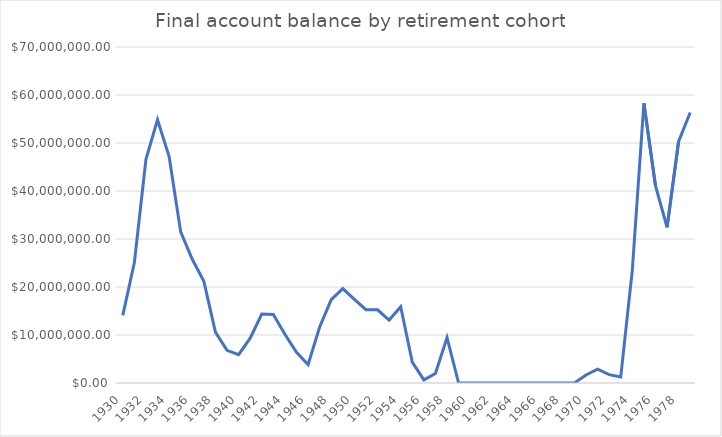
| Category | Series 0 |
|---|---|
| 1930.0 | 14094813.856 |
| 1931.0 | 25095875.067 |
| 1932.0 | 46595267.375 |
| 1933.0 | 54841129.381 |
| 1934.0 | 47190852.395 |
| 1935.0 | 31487907.336 |
| 1936.0 | 25768316.684 |
| 1937.0 | 21182113.767 |
| 1938.0 | 10603782.453 |
| 1939.0 | 6805865.754 |
| 1940.0 | 5912888.325 |
| 1941.0 | 9337849.122 |
| 1942.0 | 14354557.753 |
| 1943.0 | 14292214.108 |
| 1944.0 | 10154979.279 |
| 1945.0 | 6375546.53 |
| 1946.0 | 3840110.596 |
| 1947.0 | 11678718.551 |
| 1948.0 | 17377714.794 |
| 1949.0 | 19674202.73 |
| 1950.0 | 17437694.834 |
| 1951.0 | 15277365.311 |
| 1952.0 | 15255503.96 |
| 1953.0 | 13103291.281 |
| 1954.0 | 15882065.875 |
| 1955.0 | 4336213.872 |
| 1956.0 | 648432.849 |
| 1957.0 | 1986513.274 |
| 1958.0 | 9469623.111 |
| 1959.0 | 0 |
| 1960.0 | 0 |
| 1961.0 | 0 |
| 1962.0 | 0 |
| 1963.0 | 0 |
| 1964.0 | 0 |
| 1965.0 | 0 |
| 1966.0 | 0 |
| 1967.0 | 0 |
| 1968.0 | 0 |
| 1969.0 | 0 |
| 1970.0 | 1662616.496 |
| 1971.0 | 2895100.056 |
| 1972.0 | 1742353.913 |
| 1973.0 | 1253285.472 |
| 1974.0 | 23515562.537 |
| 1975.0 | 58280825.642 |
| 1976.0 | 41121672.601 |
| 1977.0 | 32426197.115 |
| 1978.0 | 50341451 |
| 1979.0 | 56344630.324 |